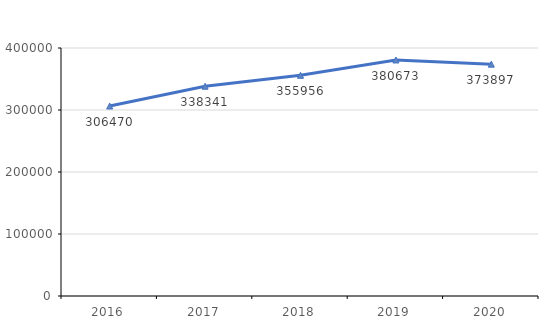
| Category | Series 0 |
|---|---|
| 2016.0 | 306470 |
| 2017.0 | 338341 |
| 2018.0 | 355956 |
| 2019.0 | 380673 |
| 2020.0 | 373897 |